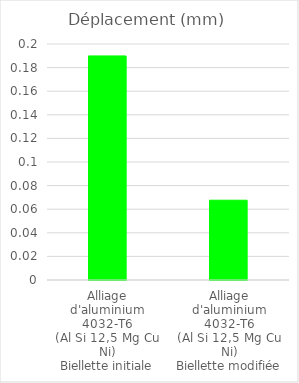
| Category | Series 0 |
|---|---|
| Alliage
d'aluminium
4032-T6
(Al Si 12,5 Mg Cu Ni)
Biellette initiale | 0.19 |
| Alliage
d'aluminium
4032-T6
(Al Si 12,5 Mg Cu Ni)
Biellette modifiée | 0.068 |